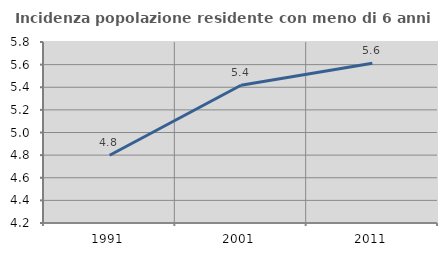
| Category | Incidenza popolazione residente con meno di 6 anni |
|---|---|
| 1991.0 | 4.799 |
| 2001.0 | 5.418 |
| 2011.0 | 5.612 |